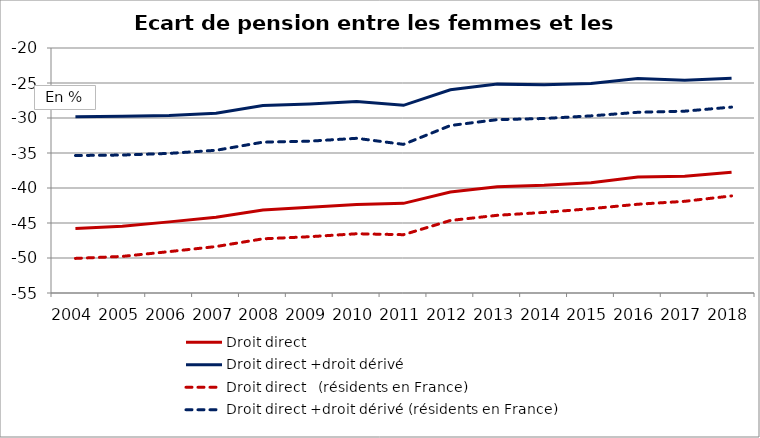
| Category | Droit direct | Droit direct +droit dérivé  | Droit direct   (résidents en France) | Droit direct +droit dérivé (résidents en France) |
|---|---|---|---|---|
| 2004.0 | -45.769 | -29.827 | -50.058 | -35.361 |
| 2005.0 | -45.459 | -29.753 | -49.772 | -35.292 |
| 2006.0 | -44.84 | -29.65 | -49.088 | -35.055 |
| 2007.0 | -44.177 | -29.324 | -48.364 | -34.613 |
| 2008.0 | -43.131 | -28.223 | -47.261 | -33.451 |
| 2009.0 | -42.749 | -28.001 | -46.957 | -33.31 |
| 2010.0 | -42.36 | -27.639 | -46.538 | -32.901 |
| 2011.0 | -42.191 | -28.187 | -46.668 | -33.765 |
| 2012.0 | -40.56 | -25.962 | -44.641 | -31.075 |
| 2013.0 | -39.813 | -25.161 | -43.901 | -30.233 |
| 2014.0 | -39.61 | -25.253 | -43.486 | -30.072 |
| 2015.0 | -39.24 | -25.076 | -42.954 | -29.697 |
| 2016.0 | -38.419 | -24.366 | -42.32 | -29.185 |
| 2017.0 | -38.313 | -24.616 | -41.902 | -29.023 |
| 2018.0 | -37.766 | -24.312 | -41.13 | -28.443 |